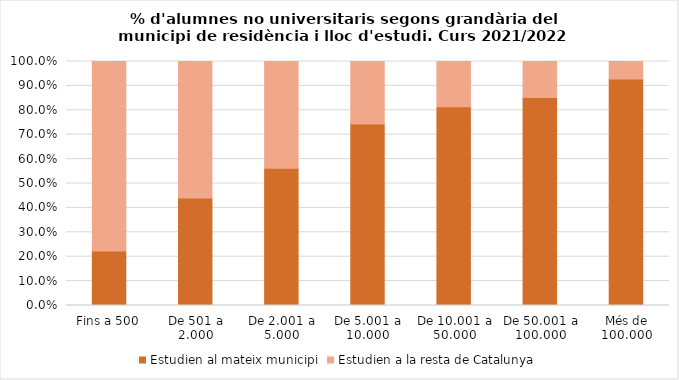
| Category | Estudien al mateix municipi | Estudien a la resta de Catalunya |
|---|---|---|
| Fins a 500 | 0.223 | 0.777 |
| De 501 a 2.000 | 0.441 | 0.559 |
| De 2.001 a 5.000 | 0.562 | 0.438 |
| De 5.001 a 10.000 | 0.744 | 0.256 |
| De 10.001 a 50.000 | 0.814 | 0.186 |
| De 50.001 a 100.000 | 0.853 | 0.147 |
| Més de 100.000 | 0.928 | 0.072 |